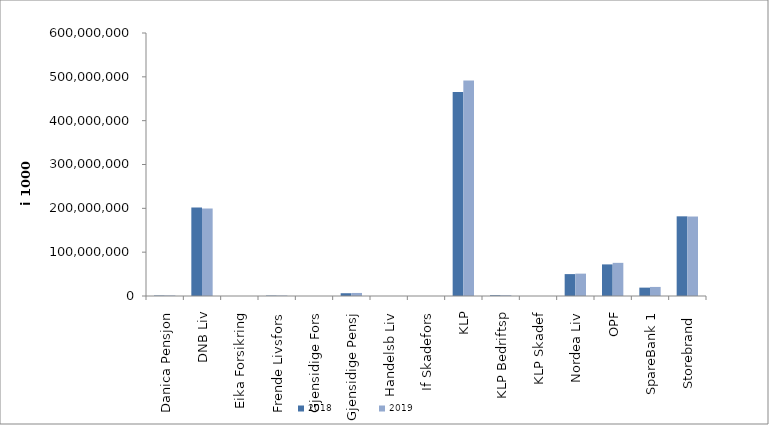
| Category | 2018 | 2019 |
|---|---|---|
| Danica Pensjon | 1062443.889 | 1199454.547 |
| DNB Liv | 201995081 | 199601126.129 |
| Eika Forsikring | 0 | 0 |
| Frende Livsfors | 913292 | 1044889 |
| Gjensidige Fors | 0 | 0 |
| Gjensidige Pensj | 6339478 | 6946187 |
| Handelsb Liv | 22086 | 16959.646 |
| If Skadefors | 0 | 0 |
| KLP | 465567937.942 | 491892859.819 |
| KLP Bedriftsp | 1675895 | 1731438 |
| KLP Skadef | 14510 | 30106 |
| Nordea Liv | 49965830 | 51019702 |
| OPF | 72102299 | 75627238.393 |
| SpareBank 1 | 19103233.846 | 20684132.106 |
| Storebrand  | 181759928.142 | 181337324.649 |